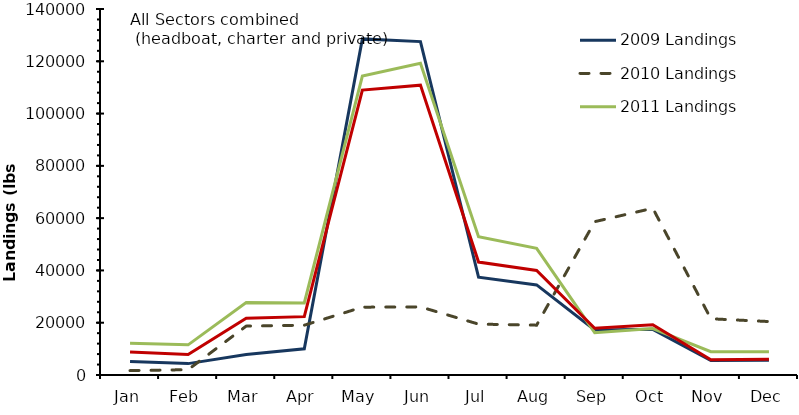
| Category | 2009 Landings | 2010 Landings | 2011 Landings | 2013 Projections |
|---|---|---|---|---|
| Jan | 5130.59 | 1677.82 | 12099.14 | 8820.987 |
| Feb | 4356.294 | 2041.543 | 11529.373 | 7836.432 |
| Mar | 7823.484 | 18695.359 | 27715.15 | 21684.917 |
| Apr | 10011.716 | 19045.142 | 27584.859 | 22319.684 |
| May | 128562.87 | 25946.686 | 114325.13 | 108984.331 |
| Jun | 127537.407 | 26047.078 | 119259.81 | 110875.968 |
| Jul | 37407.163 | 19461.89 | 52888.053 | 43190.651 |
| Aug | 34463.922 | 19068.474 | 48454.893 | 39963.883 |
| Sep | 17233.193 | 58653.114 | 16192.437 | 17898.356 |
| Oct | 17465.643 | 63777.431 | 17755.322 | 19219.573 |
| Nov | 5551.057 | 21503.784 | 8900.07 | 5794.95 |
| Dec | 5612.322 | 20442.177 | 8883.848 | 6041.415 |